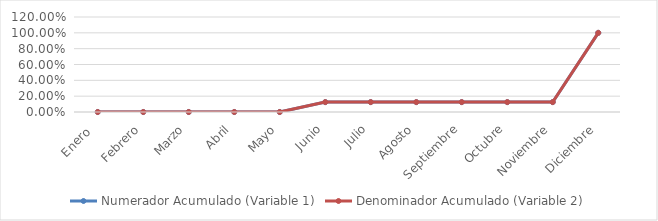
| Category | Numerador Acumulado (Variable 1) | Denominador Acumulado (Variable 2) |
|---|---|---|
| Enero  | 0 | 0 |
| Febrero | 0 | 0 |
| Marzo | 0 | 0 |
| Abril | 0 | 0 |
| Mayo | 0 | 0 |
| Junio | 0.125 | 0.125 |
| Julio | 0.125 | 0.125 |
| Agosto | 0.125 | 0.125 |
| Septiembre | 0.125 | 0.125 |
| Octubre | 0.125 | 0.125 |
| Noviembre | 0.125 | 0.125 |
| Diciembre | 1 | 1 |